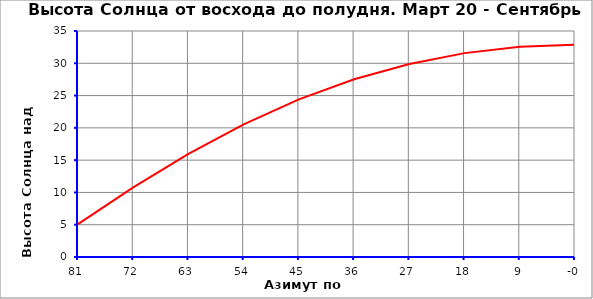
| Category | Series 1 |
|---|---|
| 80.87457174140084 | 5.096 |
| 71.88850821457852 | 10.781 |
| 62.9024446877562 | 15.984 |
| 53.91638116093388 | 20.552 |
| 44.93031763411156 | 24.405 |
| 35.94425410728924 | 27.518 |
| 26.958190580466923 | 29.9 |
| 17.972127053644606 | 31.574 |
| 8.986063526822289 | 32.567 |
| -2.842170943040401e-14 | 32.895 |